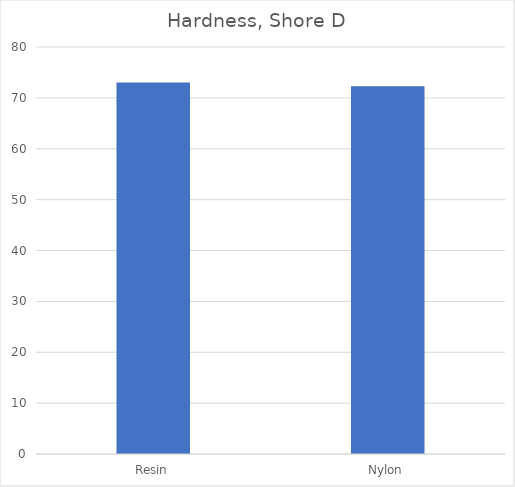
| Category | Shore D |
|---|---|
| Resin | 73 |
| Nylon | 72.3 |